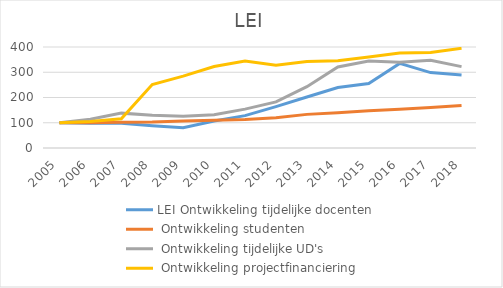
| Category | LEI Ontwikkeling tijdelijke docenten | LEI Ontwikkeling studenten | LEI Ontwikkeling tijdelijke UD's | LEI Ontwikkeling projectfinanciering |
|---|---|---|---|---|
| 2005.0 | 100 | 100 | 100 | 100 |
| 2006.0 | 98.058 | 100.104 | 114.286 | 105.263 |
| 2007.0 | 98.058 | 101.89 | 138.095 | 115.579 |
| 2008.0 | 88.35 | 102.514 | 130.159 | 251.579 |
| 2009.0 | 80.583 | 107.225 | 125.397 | 284.632 |
| 2010.0 | 106.796 | 109.965 | 131.746 | 322.526 |
| 2011.0 | 128.155 | 112.786 | 153.968 | 344.421 |
| 2012.0 | 164.078 | 119.734 | 182.54 | 328.211 |
| 2013.0 | 201.942 | 133.173 | 242.857 | 342.105 |
| 2014.0 | 239.806 | 139.971 | 320.635 | 345.474 |
| 2015.0 | 255.34 | 147.191 | 344.444 | 360.842 |
| 2016.0 | 334.951 | 153.156 | 339.683 | 376 |
| 2017.0 | 298.544 | 160.249 | 347.556 | 378.316 |
| 2018.0 | 289.243 | 167.89 | 322.381 | 394.947 |